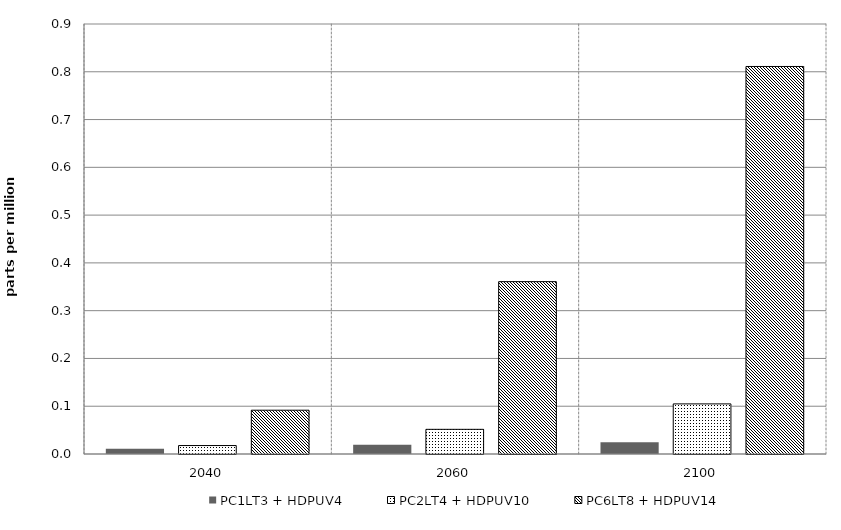
| Category | PC1LT3 + HDPUV4 | PC2LT4 + HDPUV10 | PC6LT8 + HDPUV14 | Alt 5 | Alt 6 | Alt 7 | Alt 8 | Alt 10 |
|---|---|---|---|---|---|---|---|---|
| 2040.0 | 0.011 | 0.018 | 0.092 |  |  |  |  |  |
| 2060.0 | 0.019 | 0.052 | 0.361 |  |  |  |  |  |
| 2100.0 | 0.025 | 0.105 | 0.811 |  |  |  |  |  |